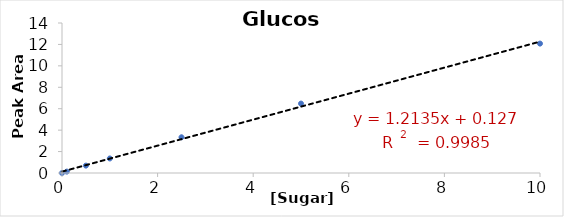
| Category | Series 0 |
|---|---|
| 0.0 | 0 |
| 0.1 | 0.13 |
| 0.5 | 0.688 |
| 1.0 | 1.356 |
| 2.5 | 3.336 |
| 5.0 | 6.478 |
| 10.0 | 12.078 |